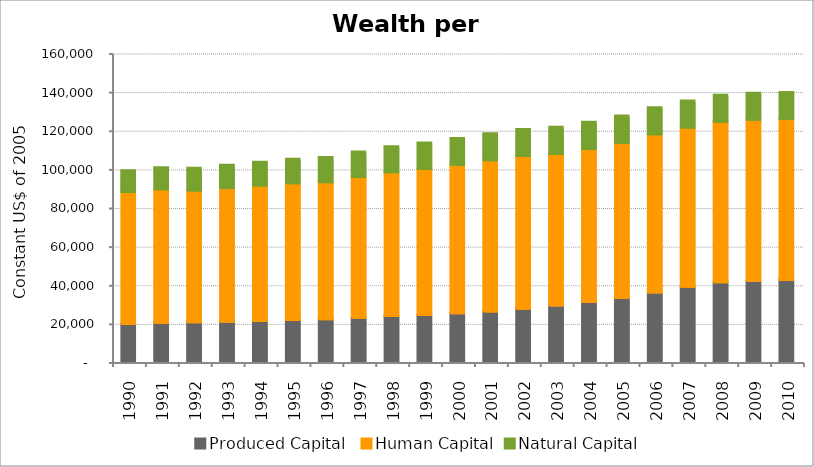
| Category | Produced Capital  | Human Capital | Natural Capital |
|---|---|---|---|
| 1990.0 | 19639.911 | 68371.24 | 11006.924 |
| 1991.0 | 20297.387 | 69109.385 | 11204.524 |
| 1992.0 | 20520.574 | 68265.483 | 11476.598 |
| 1993.0 | 20867.922 | 69172.045 | 11801.48 |
| 1994.0 | 21282.195 | 70053.266 | 12140.211 |
| 1995.0 | 21688.031 | 70845.544 | 12458.202 |
| 1996.0 | 22189.092 | 70945.644 | 12740.075 |
| 1997.0 | 22878.903 | 72869.223 | 12989.137 |
| 1998.0 | 23790.724 | 74481.218 | 13208.277 |
| 1999.0 | 24396.254 | 75621.886 | 13408.88 |
| 2000.0 | 25206.427 | 76877.396 | 13600.242 |
| 2001.0 | 26189.02 | 78259.337 | 13674.799 |
| 2002.0 | 27564.322 | 79084.959 | 13732.521 |
| 2003.0 | 29256.302 | 78478.823 | 13775.573 |
| 2004.0 | 31030.351 | 79240.672 | 13806.802 |
| 2005.0 | 33162.102 | 80389.616 | 13828.795 |
| 2006.0 | 35959.82 | 81923.22 | 13808.379 |
| 2007.0 | 39017.269 | 82358.18 | 13781.193 |
| 2008.0 | 41272.242 | 83126.932 | 13749.481 |
| 2009.0 | 41991.779 | 83499.72 | 13715.567 |
| 2010.0 | 42471.894 | 83392.766 | 13681.352 |